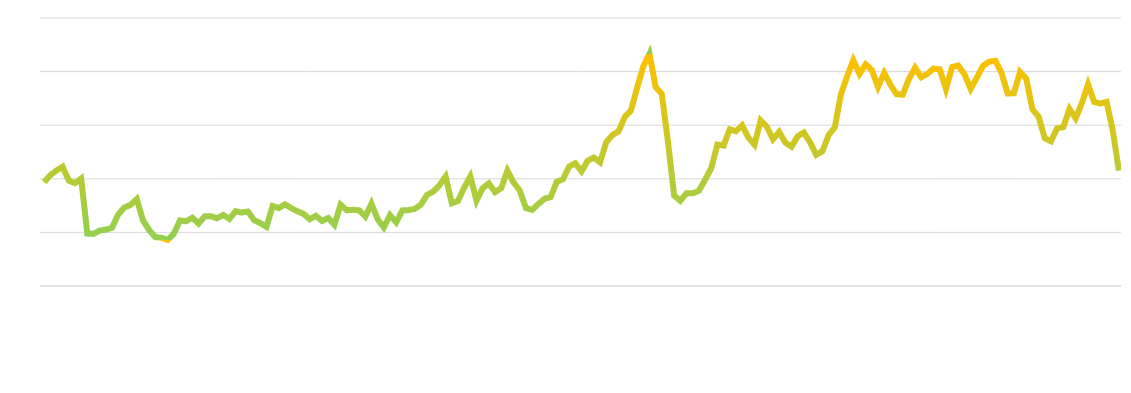
| Category | Series 0 |
|---|---|
| 0 | 9.685 |
| 1 | 10.334 |
| 2 | 10.77 |
| 3 | 11.127 |
| 4 | 9.829 |
| 5 | 9.598 |
| 6 | 10.025 |
| 7 | 4.888 |
| 8 | 4.857 |
| 9 | 5.173 |
| 10 | 5.26 |
| 11 | 5.431 |
| 12 | 6.681 |
| 13 | 7.325 |
| 14 | 7.57 |
| 15 | 8.11 |
| 16 | 6.134 |
| 17 | 5.221 |
| 18 | 4.555 |
| 19 | 4.507 |
| 20 | 4.304 |
| 21 | 4.871 |
| 22 | 6.115 |
| 23 | 6.037 |
| 24 | 6.366 |
| 25 | 5.824 |
| 26 | 6.494 |
| 27 | 6.508 |
| 28 | 6.318 |
| 29 | 6.632 |
| 30 | 6.256 |
| 31 | 6.979 |
| 32 | 6.857 |
| 33 | 6.944 |
| 34 | 6.144 |
| 35 | 5.866 |
| 36 | 5.519 |
| 37 | 7.465 |
| 38 | 7.27 |
| 39 | 7.624 |
| 40 | 7.27 |
| 41 | 6.967 |
| 42 | 6.733 |
| 43 | 6.225 |
| 44 | 6.548 |
| 45 | 6.069 |
| 46 | 6.34 |
| 47 | 5.715 |
| 48 | 7.586 |
| 49 | 7.072 |
| 50 | 7.109 |
| 51 | 7.062 |
| 52 | 6.479 |
| 53 | 7.675 |
| 54 | 6.233 |
| 55 | 5.461 |
| 56 | 6.608 |
| 57 | 5.936 |
| 58 | 7.053 |
| 59 | 7.078 |
| 60 | 7.192 |
| 61 | 7.585 |
| 62 | 8.502 |
| 63 | 8.813 |
| 64 | 9.389 |
| 65 | 10.211 |
| 66 | 7.719 |
| 67 | 7.928 |
| 68 | 9.17 |
| 69 | 10.216 |
| 70 | 7.958 |
| 71 | 9.121 |
| 72 | 9.574 |
| 73 | 8.762 |
| 74 | 9.12 |
| 75 | 10.76 |
| 76 | 9.66 |
| 77 | 8.91 |
| 78 | 7.27 |
| 79 | 7.098 |
| 80 | 7.649 |
| 81 | 8.128 |
| 82 | 8.298 |
| 83 | 9.719 |
| 84 | 9.959 |
| 85 | 11.143 |
| 86 | 11.452 |
| 87 | 10.692 |
| 88 | 11.685 |
| 89 | 11.98 |
| 90 | 11.534 |
| 91 | 13.406 |
| 92 | 14.078 |
| 93 | 14.431 |
| 94 | 15.764 |
| 95 | 16.354 |
| 96 | 18.473 |
| 97 | 20.481 |
| 98 | 21.664 |
| 99 | 18.57 |
| 100 | 17.916 |
| 101 | 13.425 |
| 102 | 8.43 |
| 103 | 7.945 |
| 104 | 8.651 |
| 105 | 8.643 |
| 106 | 8.881 |
| 107 | 9.902 |
| 108 | 10.988 |
| 109 | 13.191 |
| 110 | 13.098 |
| 111 | 14.609 |
| 112 | 14.437 |
| 113 | 14.98 |
| 114 | 13.86 |
| 115 | 13.18 |
| 116 | 15.434 |
| 117 | 14.858 |
| 118 | 13.697 |
| 119 | 14.373 |
| 120 | 13.371 |
| 121 | 12.999 |
| 122 | 13.973 |
| 123 | 14.318 |
| 124 | 13.41 |
| 125 | 12.239 |
| 126 | 12.568 |
| 127 | 14.068 |
| 128 | 14.789 |
| 129 | 17.887 |
| 130 | 19.556 |
| 131 | 21.061 |
| 132 | 19.78 |
| 133 | 20.68 |
| 134 | 20.142 |
| 135 | 18.562 |
| 136 | 19.874 |
| 137 | 18.785 |
| 138 | 17.892 |
| 139 | 17.852 |
| 140 | 19.295 |
| 141 | 20.354 |
| 142 | 19.469 |
| 143 | 19.801 |
| 144 | 20.284 |
| 145 | 20.211 |
| 146 | 18.363 |
| 147 | 20.431 |
| 148 | 20.559 |
| 149 | 19.743 |
| 150 | 18.386 |
| 151 | 19.439 |
| 152 | 20.533 |
| 153 | 20.918 |
| 154 | 21.011 |
| 155 | 19.87 |
| 156 | 17.958 |
| 157 | 17.98 |
| 158 | 19.96 |
| 159 | 19.34 |
| 160 | 16.49 |
| 161 | 15.79 |
| 162 | 13.79 |
| 163 | 13.5 |
| 164 | 14.71 |
| 165 | 14.82 |
| 166 | 16.51 |
| 167 | 15.64 |
| 168 | 17.06 |
| 169 | 18.81 |
| 170 | 17.17 |
| 171 | 17.02 |
| 172 | 17.17 |
| 173 | 14.53 |
| 174 | 10.77 |